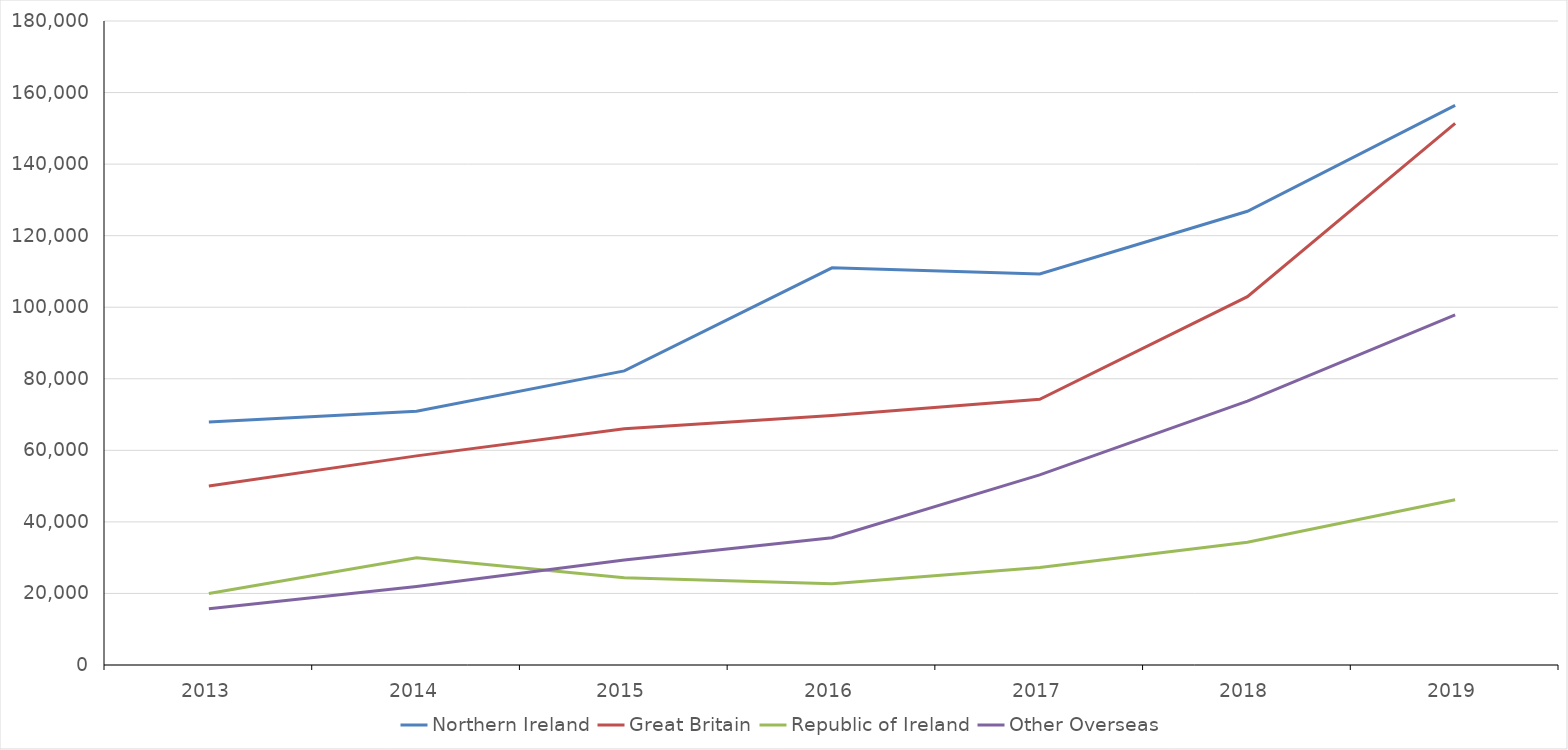
| Category | Northern Ireland | Great Britain | Republic of Ireland | Other Overseas  |
|---|---|---|---|---|
| 2013.0 | 67893.746 | 50060.601 | 19986.324 | 15724.949 |
| 2014.0 | 70929.78 | 58448.493 | 29968.279 | 21949.008 |
| 2015.0 | 82211.29 | 66011.84 | 24355.83 | 29357.58 |
| 2016.0 | 111014.12 | 69703.04 | 22739.52 | 35592.69 |
| 2017.0 | 109307.9 | 74285.26 | 27283.33 | 53129.03 |
| 2018.0 | 126809.44 | 102956.22 | 34336.78 | 73773.54 |
| 2019.0 | 156395.92 | 151387.05 | 46164.68 | 97870.28 |